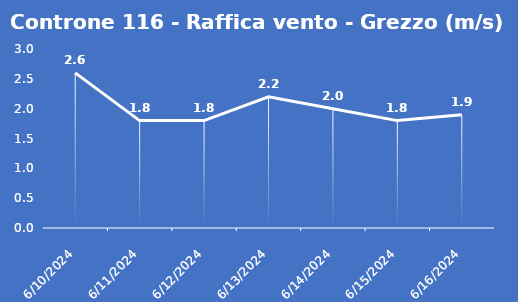
| Category | Controne 116 - Raffica vento - Grezzo (m/s) |
|---|---|
| 6/10/24 | 2.6 |
| 6/11/24 | 1.8 |
| 6/12/24 | 1.8 |
| 6/13/24 | 2.2 |
| 6/14/24 | 2 |
| 6/15/24 | 1.8 |
| 6/16/24 | 1.9 |